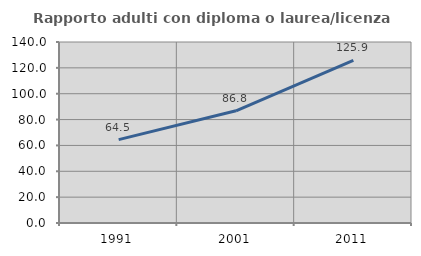
| Category | Rapporto adulti con diploma o laurea/licenza media  |
|---|---|
| 1991.0 | 64.471 |
| 2001.0 | 86.78 |
| 2011.0 | 125.855 |